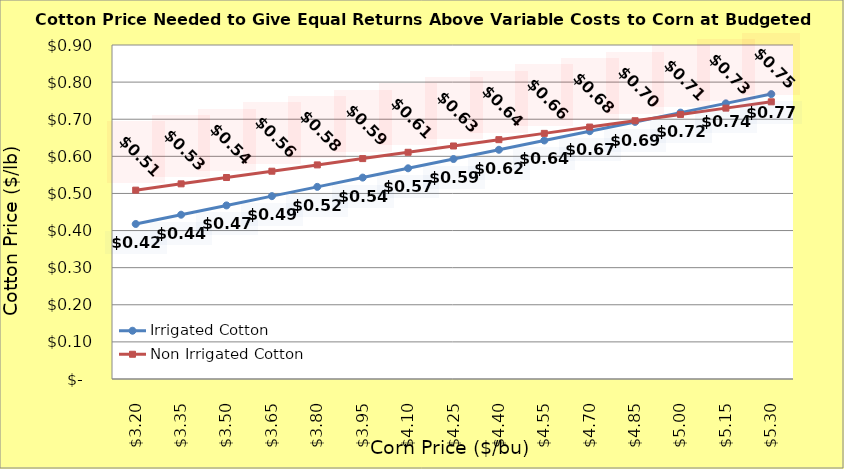
| Category | Irrigated Cotton | Non Irrigated Cotton |
|---|---|---|
| 3.2 | 0.418 | 0.509 |
| 3.35 | 0.443 | 0.526 |
| 3.5 | 0.468 | 0.543 |
| 3.65 | 0.493 | 0.56 |
| 3.8 | 0.518 | 0.577 |
| 3.9499999999999997 | 0.543 | 0.594 |
| 4.1 | 0.568 | 0.611 |
| 4.25 | 0.593 | 0.628 |
| 4.4 | 0.618 | 0.645 |
| 4.550000000000001 | 0.643 | 0.662 |
| 4.700000000000001 | 0.668 | 0.679 |
| 4.850000000000001 | 0.693 | 0.696 |
| 5.000000000000002 | 0.718 | 0.713 |
| 5.150000000000002 | 0.743 | 0.73 |
| 5.3000000000000025 | 0.768 | 0.747 |